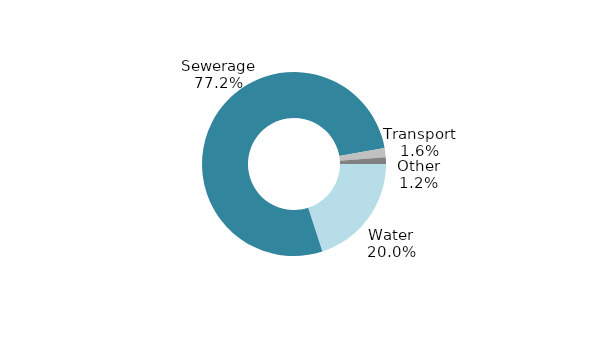
| Category | Series 3 |
|---|---|
| Water | 0.2 |
| Sewerage | 0.772 |
| Transport | 0.016 |
| Other | 0.012 |